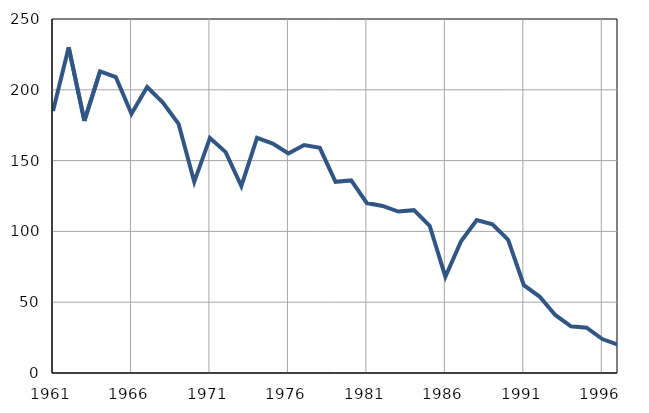
| Category | Infants
deaths |
|---|---|
| 1961.0 | 185 |
| 1962.0 | 230 |
| 1963.0 | 178 |
| 1964.0 | 213 |
| 1965.0 | 209 |
| 1966.0 | 183 |
| 1967.0 | 202 |
| 1968.0 | 191 |
| 1969.0 | 176 |
| 1970.0 | 135 |
| 1971.0 | 166 |
| 1972.0 | 156 |
| 1973.0 | 132 |
| 1974.0 | 166 |
| 1975.0 | 162 |
| 1976.0 | 155 |
| 1977.0 | 161 |
| 1978.0 | 159 |
| 1979.0 | 135 |
| 1980.0 | 136 |
| 1981.0 | 120 |
| 1982.0 | 118 |
| 1983.0 | 114 |
| 1984.0 | 115 |
| 1985.0 | 104 |
| 1986.0 | 68 |
| 1987.0 | 93 |
| 1988.0 | 108 |
| 1989.0 | 105 |
| 1990.0 | 94 |
| 1991.0 | 62 |
| 1992.0 | 54 |
| 1993.0 | 41 |
| 1994.0 | 33 |
| 1995.0 | 32 |
| 1996.0 | 24 |
| 1997.0 | 20 |